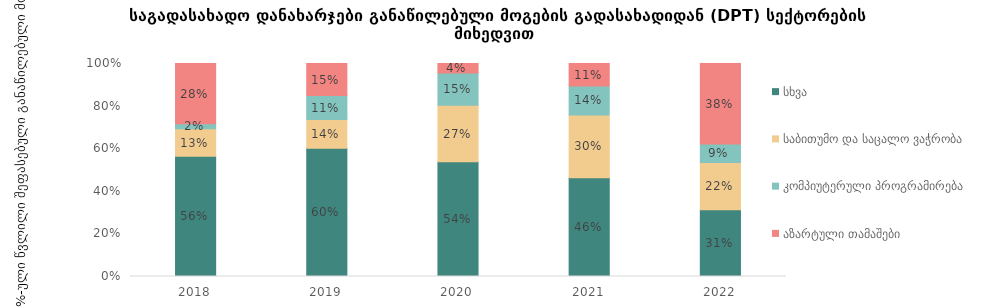
| Category | სხვა | საბითუმო და საცალო ვაჭრობა | კომპიუტერული პროგრამირება | აზარტული თამაშები |
|---|---|---|---|---|
| 2018.0 | 0.564 | 0.13 | 0.023 | 0.283 |
| 2019.0 | 0.602 | 0.135 | 0.112 | 0.151 |
| 2020.0 | 0.538 | 0.266 | 0.152 | 0.044 |
| 2021.0 | 0.463 | 0.296 | 0.136 | 0.106 |
| 2022.0 | 0.313 | 0.222 | 0.086 | 0.378 |